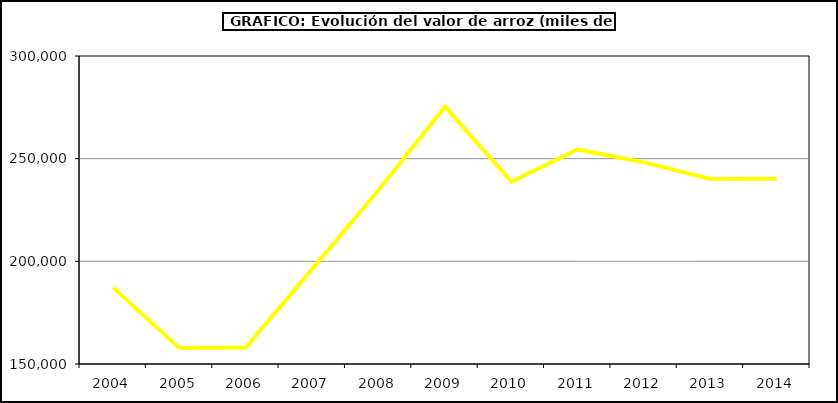
| Category | Valor |
|---|---|
| 2004.0 | 187193.16 |
| 2005.0 | 157735.42 |
| 2006.0 | 158053.388 |
| 2007.0 | 196337.816 |
| 2008.0 | 234702.005 |
| 2009.0 | 275314.08 |
| 2010.0 | 238727.314 |
| 2011.0 | 254491.862 |
| 2012.0 | 248198.159 |
| 2013.0 | 240076.744 |
| 2014.0 | 240232 |